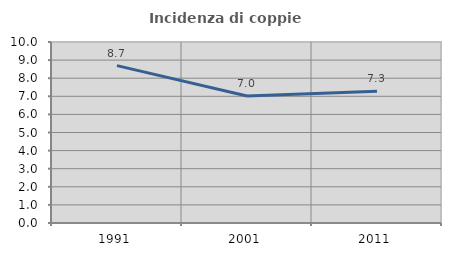
| Category | Incidenza di coppie miste |
|---|---|
| 1991.0 | 8.696 |
| 2001.0 | 7.018 |
| 2011.0 | 7.273 |